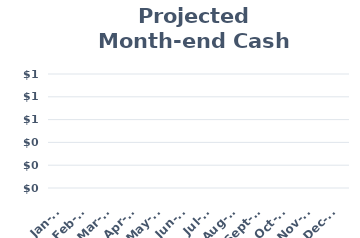
| Category | Ending Cash Balance |
|---|---|
| 2021-01-01 | 0 |
| 2021-02-01 | 0 |
| 2021-03-01 | 0 |
| 2021-04-01 | 0 |
| 2021-05-01 | 0 |
| 2021-06-01 | 0 |
| 2021-07-01 | 0 |
| 2021-08-01 | 0 |
| 2021-09-01 | 0 |
| 2021-10-01 | 0 |
| 2021-11-01 | 0 |
| 2021-12-01 | 0 |